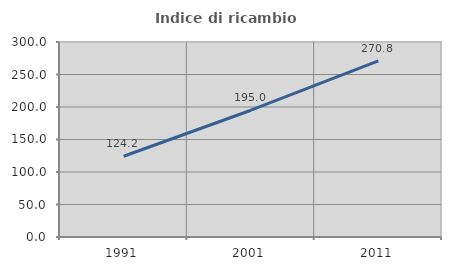
| Category | Indice di ricambio occupazionale  |
|---|---|
| 1991.0 | 124.18 |
| 2001.0 | 195.041 |
| 2011.0 | 270.825 |